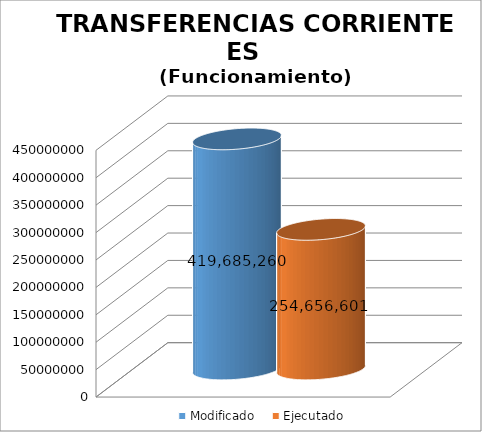
| Category | Modificado | Ejecutado |
|---|---|---|
| 0 | 419685260 | 254656600.77 |